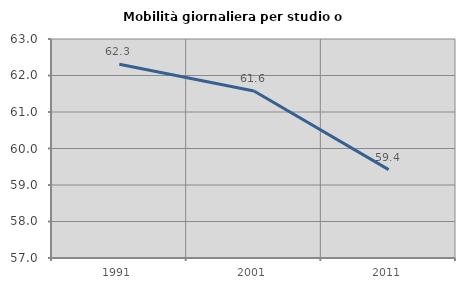
| Category | Mobilità giornaliera per studio o lavoro |
|---|---|
| 1991.0 | 62.309 |
| 2001.0 | 61.574 |
| 2011.0 | 59.42 |